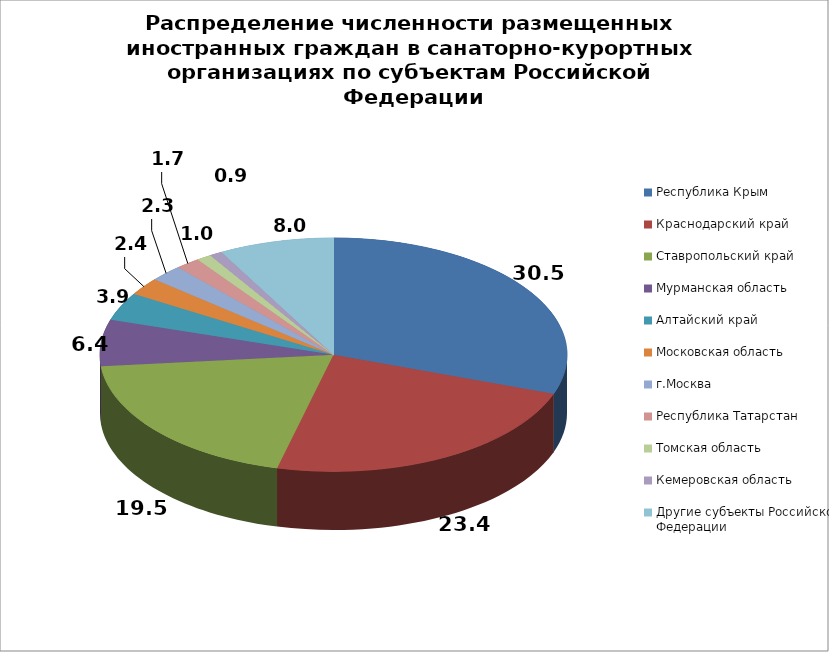
| Category | Series 0 |
|---|---|
| Республика Крым | 30.454 |
| Краснодарский край | 23.422 |
| Ставропольский край | 19.536 |
| Мурманская область | 6.432 |
| Алтайский край | 3.856 |
| Московская область | 2.434 |
| г.Москва | 2.294 |
| Республика Татарстан | 1.699 |
| Томская область | 1.034 |
| Кемеровская область | 0.875 |
| Другие субъекты Российской Федерации | 7.965 |